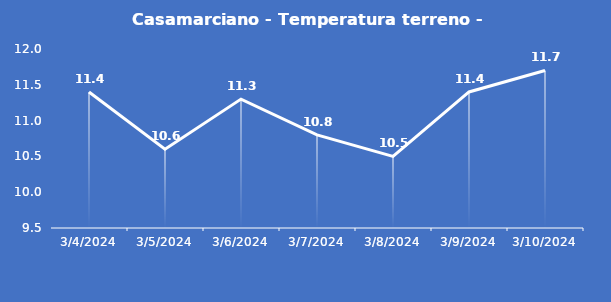
| Category | Casamarciano - Temperatura terreno - Grezzo (°C) |
|---|---|
| 3/4/24 | 11.4 |
| 3/5/24 | 10.6 |
| 3/6/24 | 11.3 |
| 3/7/24 | 10.8 |
| 3/8/24 | 10.5 |
| 3/9/24 | 11.4 |
| 3/10/24 | 11.7 |